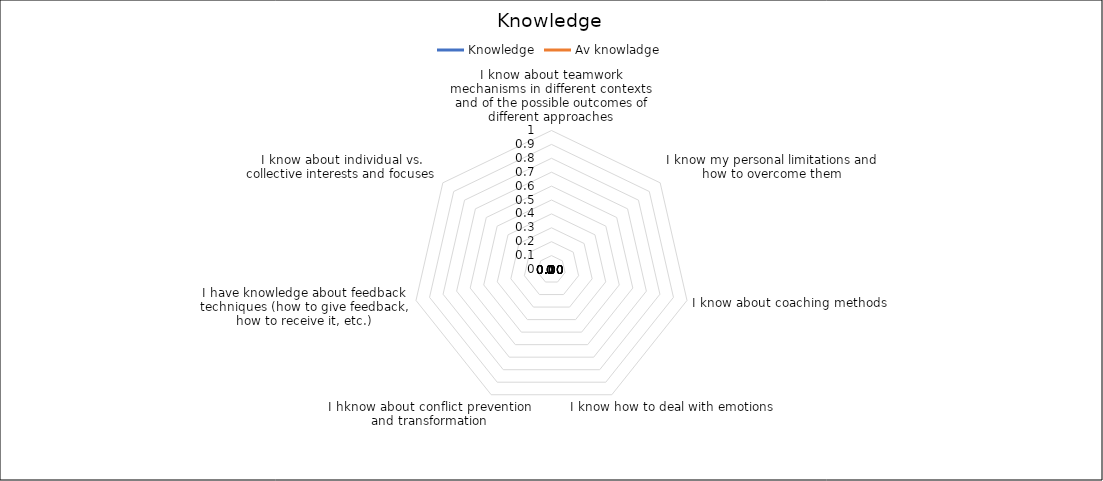
| Category | Knowledge | Av knowladge |
|---|---|---|
| I know about teamwork mechanisms in different contexts and of the possible outcomes of different approaches | 0 | 0 |
| I know my personal limitations and how to overcome them | 0 | 0 |
| I know about coaching methods | 0 | 0 |
| I know how to deal with emotions | 0 | 0 |
| I hknow about conflict prevention and transformation | 0 | 0 |
| I have knowledge about feedback techniques (how to give feedback, how to receive it, etc.) | 0 | 0 |
| I know about individual vs. collective interests and focuses | 0 | 0 |